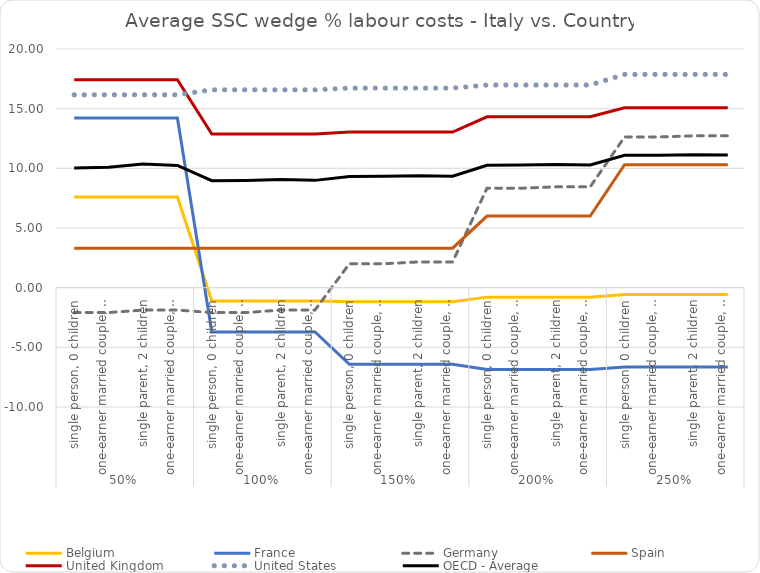
| Category | Belgium | France | Germany | Spain | United Kingdom | United States | OECD - Average |
|---|---|---|---|---|---|---|---|
| 0 | 7.589 | 14.21 | -2.086 | 3.307 | 17.427 | 16.162 | 10.035 |
| 1 | 7.589 | 14.21 | -2.086 | 3.307 | 17.427 | 16.162 | 10.082 |
| 2 | 7.589 | 14.21 | -1.877 | 3.307 | 17.427 | 16.162 | 10.359 |
| 3 | 7.589 | 14.21 | -1.877 | 3.307 | 17.427 | 16.162 | 10.239 |
| 4 | -1.115 | -3.708 | -2.086 | 3.307 | 12.867 | 16.579 | 8.963 |
| 5 | -1.115 | -3.708 | -2.086 | 3.307 | 12.867 | 16.579 | 8.986 |
| 6 | -1.115 | -3.708 | -1.877 | 3.307 | 12.867 | 16.579 | 9.068 |
| 7 | -1.115 | -3.708 | -1.877 | 3.307 | 12.867 | 16.579 | 8.992 |
| 8 | -1.17 | -6.421 | 2.006 | 3.311 | 13.041 | 16.723 | 9.313 |
| 9 | -1.17 | -6.421 | 2.006 | 3.311 | 13.041 | 16.723 | 9.329 |
| 10 | -1.17 | -6.421 | 2.155 | 3.311 | 13.041 | 16.723 | 9.386 |
| 11 | -1.17 | -6.421 | 2.155 | 3.311 | 13.041 | 16.723 | 9.333 |
| 12 | -0.793 | -6.858 | 8.335 | 5.996 | 14.317 | 16.982 | 10.26 |
| 13 | -0.793 | -6.858 | 8.335 | 5.996 | 14.317 | 16.982 | 10.273 |
| 14 | -0.793 | -6.858 | 8.451 | 5.996 | 14.317 | 16.982 | 10.316 |
| 15 | -0.793 | -6.858 | 8.451 | 5.996 | 14.317 | 16.982 | 10.276 |
| 16 | -0.563 | -6.653 | 12.629 | 10.302 | 15.078 | 17.869 | 11.096 |
| 17 | -0.563 | -6.653 | 12.629 | 10.302 | 15.078 | 17.869 | 11.106 |
| 18 | -0.563 | -6.653 | 12.724 | 10.302 | 15.078 | 17.869 | 11.141 |
| 19 | -0.563 | -6.653 | 12.724 | 10.302 | 15.078 | 17.869 | 11.108 |